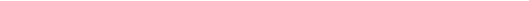
| Category | Tributos internos (Millones soles) |
|---|---|
| 0 | 1 |